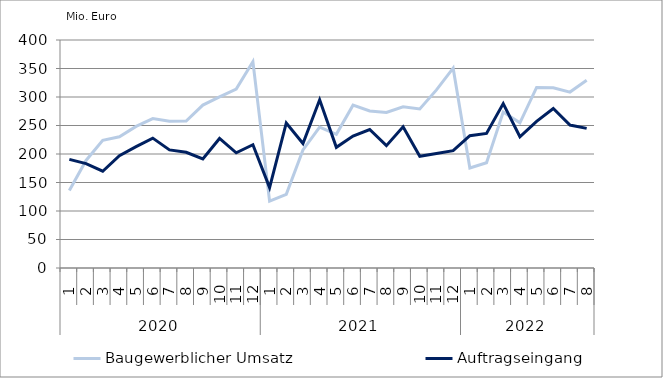
| Category | Baugewerblicher Umsatz | Auftragseingang |
|---|---|---|
| 0 | 136135.432 | 190647.086 |
| 1 | 188682.361 | 183141.14 |
| 2 | 224009.315 | 169770.009 |
| 3 | 230172.252 | 196979.845 |
| 4 | 248410.714 | 212955.83 |
| 5 | 262078.128 | 227853.487 |
| 6 | 257360.37 | 207209.188 |
| 7 | 257932.168 | 202976.091 |
| 8 | 285866.269 | 191463.844 |
| 9 | 300164.57 | 227245.467 |
| 10 | 313922.518 | 202060.636 |
| 11 | 362040.738 | 216296.504 |
| 12 | 117421.805 | 141020.655 |
| 13 | 129162.55 | 254416.876 |
| 14 | 207280.837 | 218451.405 |
| 15 | 247094.279 | 295077.868 |
| 16 | 234515.312 | 211696.129 |
| 17 | 285732.845 | 231455.155 |
| 18 | 275480.885 | 242932.505 |
| 19 | 272787.524 | 214636.944 |
| 20 | 282850.254 | 247827.991 |
| 21 | 279173.21 | 196069.238 |
| 22 | 312511.437 | 201015.897 |
| 23 | 350582.01 | 205949.991 |
| 24 | 175456.852 | 232178.255 |
| 25 | 184578.32 | 236006.862 |
| 26 | 273732.567 | 288451.109 |
| 27 | 254683.671 | 230228.968 |
| 28 | 316794.568 | 257235.39 |
| 29 | 316277.567 | 279900.179 |
| 30 | 308621.034 | 250827.343 |
| 31 | 329490.411 | 244949.341 |